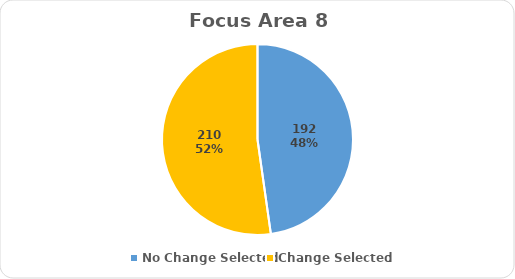
| Category | Series 0 |
|---|---|
| No Change Selected | 192 |
| Change Selected | 210 |